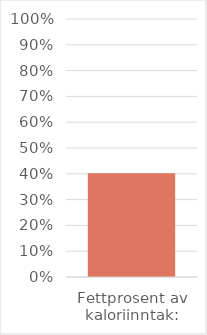
| Category | Series 0 |
|---|---|
| Fettprosent av kaloriinntak: | 0.402 |